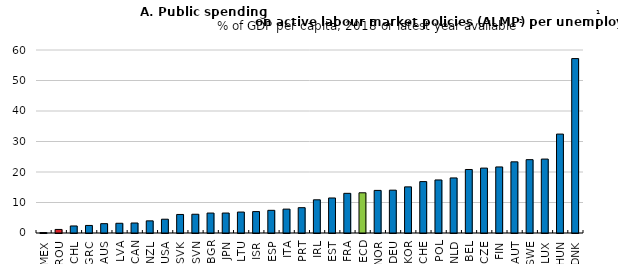
| Category | Series 0 |
|---|---|
| MEX | 0.149 |
| ROU | 1.163 |
| CHL | 2.306 |
| GRC | 2.477 |
| AUS | 3.06 |
| LVA | 3.188 |
| CAN | 3.278 |
| NZL | 3.981 |
| USA | 4.523 |
| SVK | 6.079 |
| SVN | 6.149 |
| BGR | 6.539 |
| JPN | 6.547 |
| LTU | 6.865 |
| ISR | 7.022 |
| ESP | 7.435 |
| ITA | 7.83 |
| PRT | 8.3 |
| IRL | 10.881 |
| EST | 11.482 |
| FRA | 13.004 |
| OECD | 13.181 |
| NOR | 13.97 |
| DEU | 14.044 |
| KOR | 15.125 |
| CHE | 16.851 |
| POL | 17.392 |
| NLD | 18.053 |
| BEL | 20.822 |
| CZE | 21.28 |
| FIN | 21.66 |
| AUT | 23.335 |
| SWE | 24.044 |
| LUX | 24.24 |
| HUN | 32.43 |
| DNK | 57.186 |